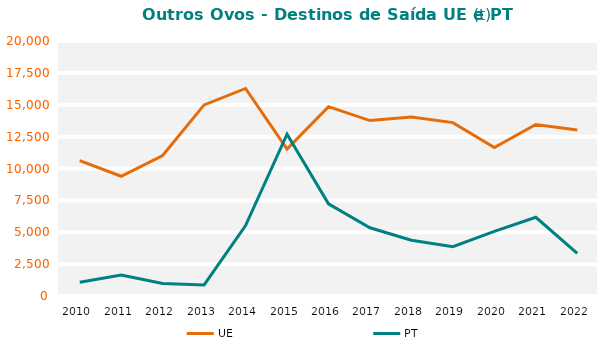
| Category | UE | PT |
|---|---|---|
| 2010.0 | 10613.589 | 1083.549 |
| 2011.0 | 9392.71 | 1639.534 |
| 2012.0 | 11016.587 | 973.408 |
| 2013.0 | 14988.607 | 871.692 |
| 2014.0 | 16277.481 | 5525.64 |
| 2015.0 | 11522.084 | 12692.674 |
| 2016.0 | 14846.918 | 7224.319 |
| 2017.0 | 13758.705 | 5349.259 |
| 2018.0 | 14044.161 | 4371.601 |
| 2019.0 | 13598.002 | 3862.196 |
| 2020.0 | 11646.599 | 5062.389 |
| 2021.0 | 13449.817 | 6175.431 |
| 2022.0 | 13023.86 | 3345.27 |